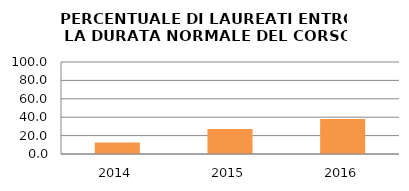
| Category | 2014 2015 2016 |
|---|---|
| 2014.0 | 12.5 |
| 2015.0 | 27.273 |
| 2016.0 | 38.095 |